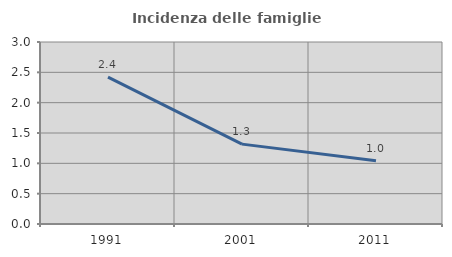
| Category | Incidenza delle famiglie numerose |
|---|---|
| 1991.0 | 2.42 |
| 2001.0 | 1.317 |
| 2011.0 | 1.041 |